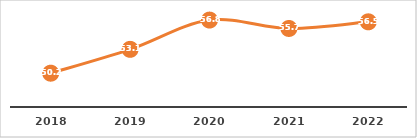
| Category | EFICIENCIA TERMINAL (%) |
|---|---|
| 2018.0 | 50.182 |
| 2019.0 | 53.131 |
| 2020.0 | 56.755 |
| 2021.0 | 55.714 |
| 2022.0 | 56.537 |